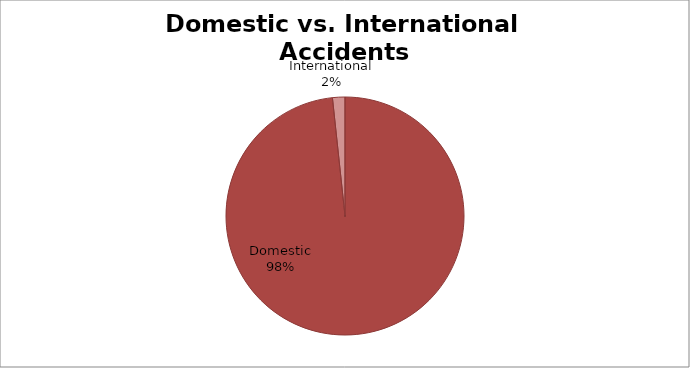
| Category | Series 0 |
|---|---|
| Domestic | 233 |
| International | 4 |